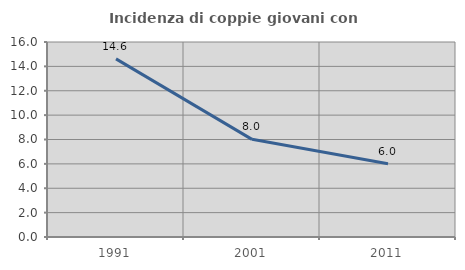
| Category | Incidenza di coppie giovani con figli |
|---|---|
| 1991.0 | 14.618 |
| 2001.0 | 8.013 |
| 2011.0 | 6.006 |